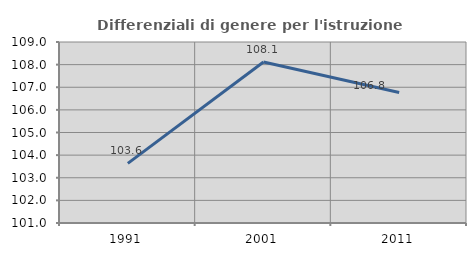
| Category | Differenziali di genere per l'istruzione superiore |
|---|---|
| 1991.0 | 103.636 |
| 2001.0 | 108.115 |
| 2011.0 | 106.766 |